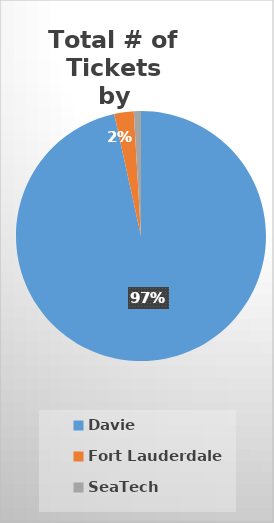
| Category | Series 0 |
|---|---|
| Davie | 0.966 |
| Fort Lauderdale | 0.025 |
| SeaTech | 0.009 |